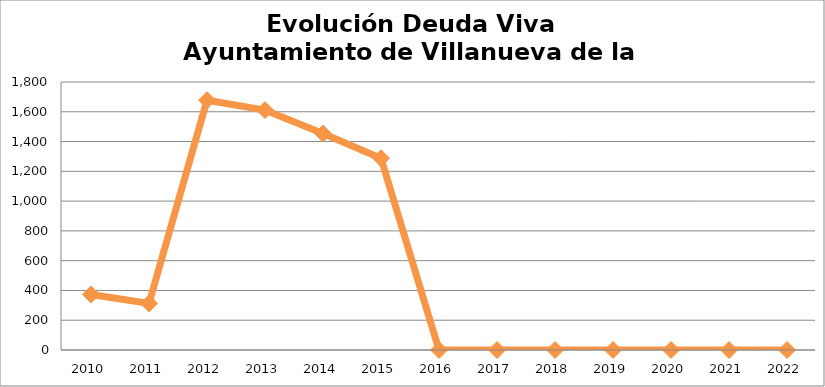
| Category | Series 0 |
|---|---|
| 2010.0 | 373 |
| 2011.0 | 313 |
| 2012.0 | 1677.854 |
| 2013.0 | 1611.855 |
| 2014.0 | 1453.739 |
| 2015.0 | 1288 |
| 2016.0 | 0 |
| 2017.0 | 0 |
| 2018.0 | 0 |
| 2019.0 | 0 |
| 2020.0 | 0 |
| 2021.0 | 0 |
| 2022.0 | 0 |